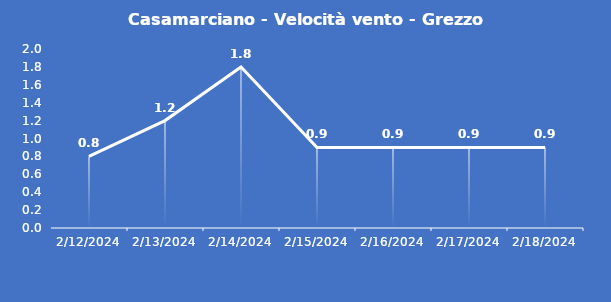
| Category | Casamarciano - Velocità vento - Grezzo (m/s) |
|---|---|
| 2/12/24 | 0.8 |
| 2/13/24 | 1.2 |
| 2/14/24 | 1.8 |
| 2/15/24 | 0.9 |
| 2/16/24 | 0.9 |
| 2/17/24 | 0.9 |
| 2/18/24 | 0.9 |